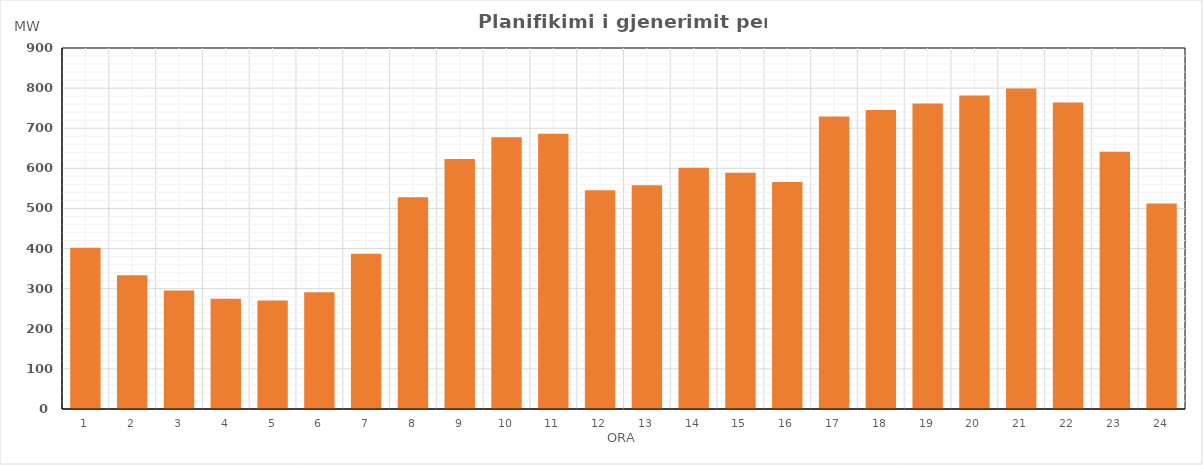
| Category | Max (MW) |
|---|---|
| 0 | 402.13 |
| 1 | 333.29 |
| 2 | 295.48 |
| 3 | 274.98 |
| 4 | 270.56 |
| 5 | 290.92 |
| 6 | 387.27 |
| 7 | 527.99 |
| 8 | 623.55 |
| 9 | 677.35 |
| 10 | 685.99 |
| 11 | 545.18 |
| 12 | 558.12 |
| 13 | 601.6 |
| 14 | 589.16 |
| 15 | 566.16 |
| 16 | 729.27 |
| 17 | 745.27 |
| 18 | 761.89 |
| 19 | 781.89 |
| 20 | 799.34 |
| 21 | 763.95 |
| 22 | 641.26 |
| 23 | 512.3 |